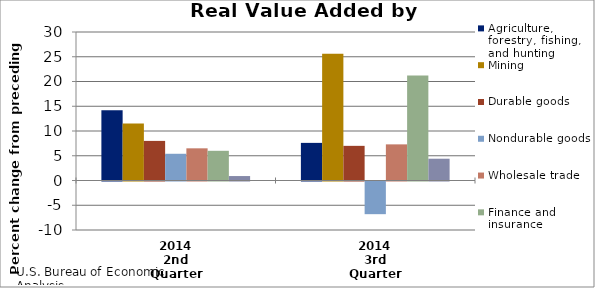
| Category | Agriculture, forestry, fishing, and hunting | Mining | Durable goods | Nondurable goods | Wholesale trade | Finance and insurance | Real estate and rental and leasing |
|---|---|---|---|---|---|---|---|
| 2014
2nd Quarter | 14.2 | 11.5 | 8 | 5.4 | 6.5 | 6 | 0.9 |
| 2014
3rd Quarter | 7.6 | 25.6 | 7 | -6.6 | 7.3 | 21.2 | 4.4 |